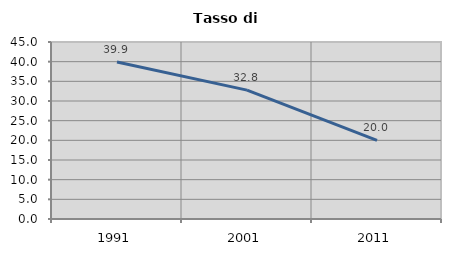
| Category | Tasso di disoccupazione   |
|---|---|
| 1991.0 | 39.9 |
| 2001.0 | 32.771 |
| 2011.0 | 20.013 |